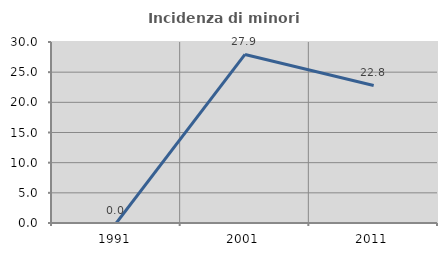
| Category | Incidenza di minori stranieri |
|---|---|
| 1991.0 | 0 |
| 2001.0 | 27.941 |
| 2011.0 | 22.8 |